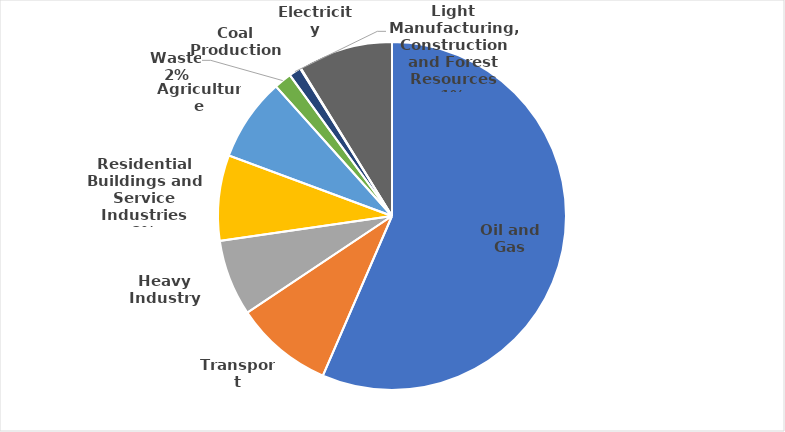
| Category | CO2eq |
|---|---|
| Oil and Gas | 144.729 |
| Transport | 23.374 |
| Heavy Industry | 18.142 |
| Residential Buildings and Service Industries | 20.355 |
| Agriculture | 19.763 |
| Waste | 4.198 |
| Light Manufacturing, Construction and Forest Resources | 2.889 |
| Coal Production | 0.164 |
| Electricity | 22.535 |